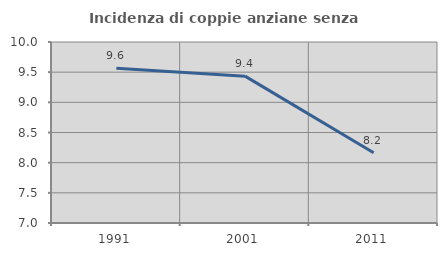
| Category | Incidenza di coppie anziane senza figli  |
|---|---|
| 1991.0 | 9.565 |
| 2001.0 | 9.434 |
| 2011.0 | 8.163 |